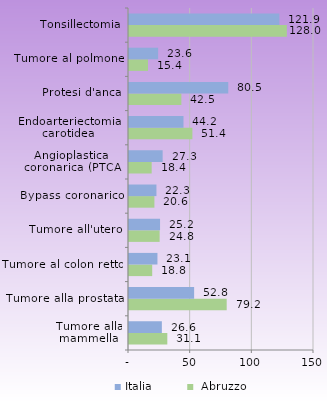
| Category |  Abruzzo | Italia |
|---|---|---|
| Tumore alla mammella | 31.069 | 26.639 |
| Tumore alla prostata | 79.211 | 52.808 |
| Tumore al colon retto | 18.812 | 23.067 |
| Tumore all'utero | 24.836 | 25.177 |
| Bypass coronarico | 20.6 | 22.251 |
| Angioplastica 
coronarica (PTCA) | 18.383 | 27.281 |
| Endoarteriectomia
carotidea | 51.403 | 44.178 |
| Protesi d'anca | 42.46 | 80.484 |
| Tumore al polmone | 15.409 | 23.614 |
| Tonsillectomia | 127.987 | 121.92 |